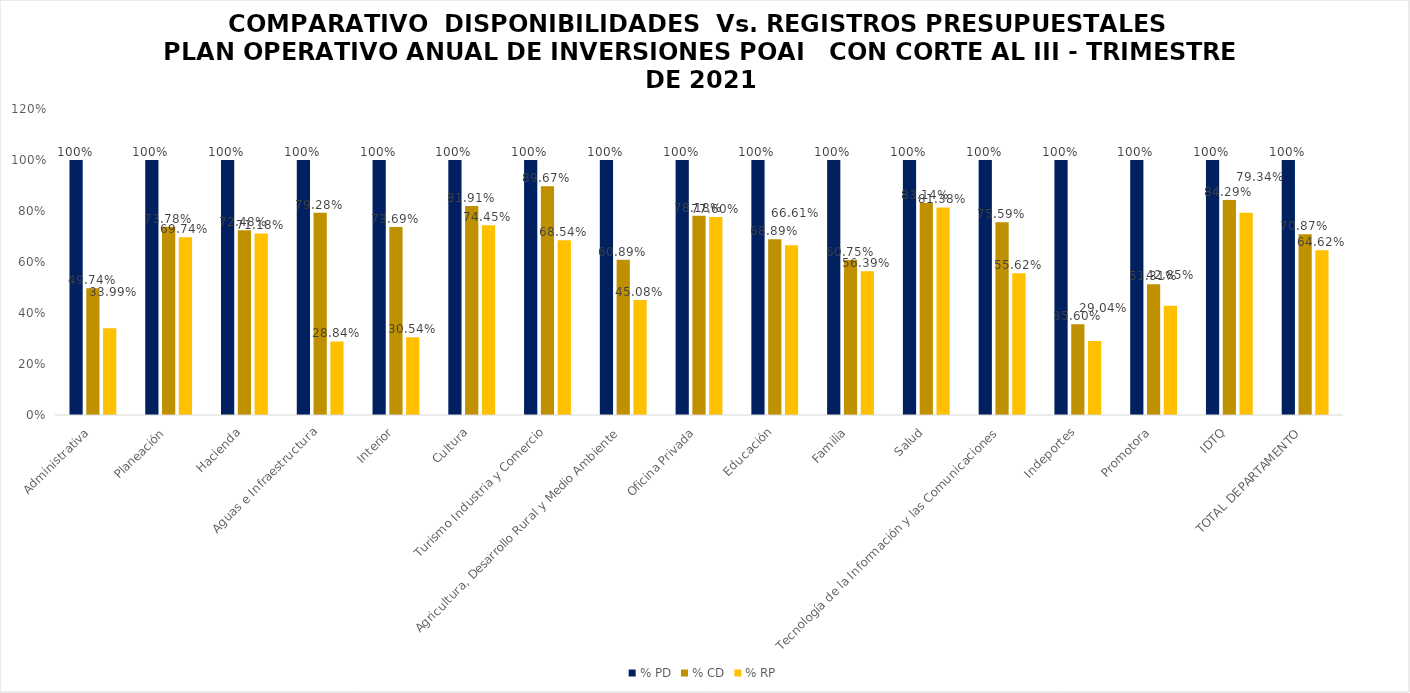
| Category | % PD | % CD | % RP |
|---|---|---|---|
| Administrativa | 1 | 0.497 | 0.34 |
| Planeación | 1 | 0.738 | 0.697 |
| Hacienda | 1 | 0.725 | 0.712 |
| Aguas e Infraestructura | 1 | 0.793 | 0.288 |
| Interior | 1 | 0.737 | 0.305 |
| Cultura | 1 | 0.819 | 0.744 |
| Turismo Industria y Comercio | 1 | 0.897 | 0.685 |
| Agricultura, Desarrollo Rural y Medio Ambiente | 1 | 0.609 | 0.451 |
| Oficina Privada | 1 | 0.782 | 0.776 |
| Educación | 1 | 0.689 | 0.666 |
| Familia | 1 | 0.608 | 0.564 |
| Salud | 1 | 0.831 | 0.814 |
| Tecnología de la Información y las Comunicaciones | 1 | 0.756 | 0.556 |
| Indeportes | 1 | 0.356 | 0.29 |
| Promotora | 1 | 0.513 | 0.429 |
| IDTQ | 1 | 0.843 | 0.793 |
| TOTAL DEPARTAMENTO | 1 | 0.709 | 0.646 |